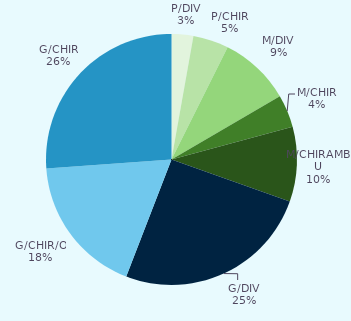
| Category | Series 0 |
|---|---|
| P/DIV | 0.028 |
| P/CHIR | 0.046 |
| M/DIV | 0.092 |
| M/CHIR | 0.042 |
| M/CHIRAMBU | 0.096 |
| G/DIV | 0.254 |
| G/CHIR/O | 0.18 |
| G/CHIR | 0.261 |